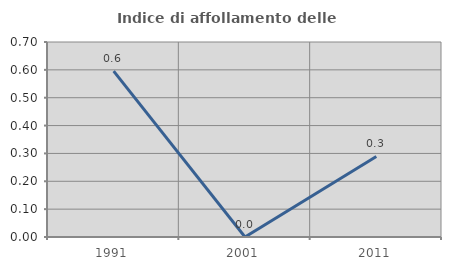
| Category | Indice di affollamento delle abitazioni  |
|---|---|
| 1991.0 | 0.595 |
| 2001.0 | 0 |
| 2011.0 | 0.289 |